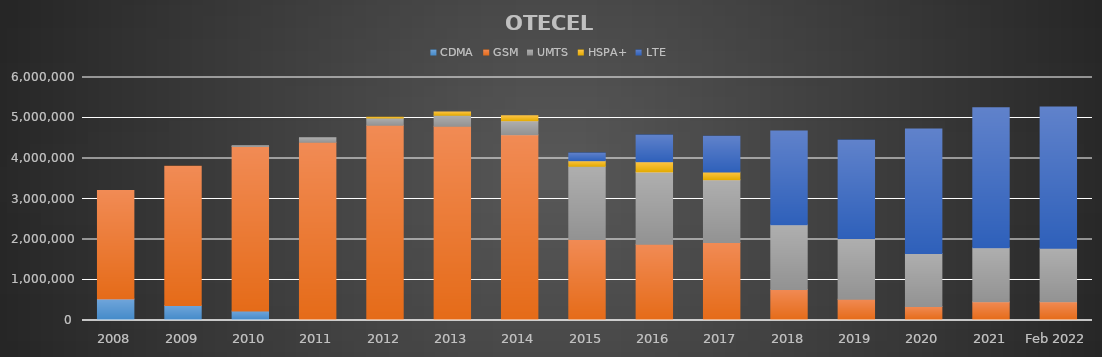
| Category | CDMA | GSM | UMTS | HSPA+ | LTE |
|---|---|---|---|---|---|
| 2008 | 533206 | 2678716 | 0 | 0 | 0 |
| 2009 | 370711 | 3435721 | 0 | 0 | 0 |
| 2010 | 232396 | 4061909 | 20294 | 0 | 0 |
| 2011 | 0 | 4403305 | 110569 | 0 | 0 |
| 2012 | 0 | 4823675 | 174375 | 21636 | 0 |
| 2013 | 0 | 4797632 | 272871 | 77805 | 0 |
| 2014 | 0 | 4589205 | 341647 | 124793 | 0 |
| 2015 | 0 | 2002436 | 1805322 | 136952 | 189988 |
| 2016 | 0 | 1881781 | 1787014 | 248541 | 662756 |
| 2017 | 0 | 1924184.634 | 1552693.066 | 187515.199 | 884631.101 |
| 2018 | 0 | 765658.891 | 1596404.415 | 0 | 2317582.694 |
| 2019 | 0 | 525011.505 | 1498097.705 | 0 | 2433246.79 |
| 2020 | 0 | 348601.621 | 1305745.099 | 0 | 3075378.28 |
| 2021 | 0 | 463116 | 1335075 | 0 | 3456277 |
| Feb 2022 | 0 | 461271.915 | 1324789.367 | 0 | 3486728.718 |